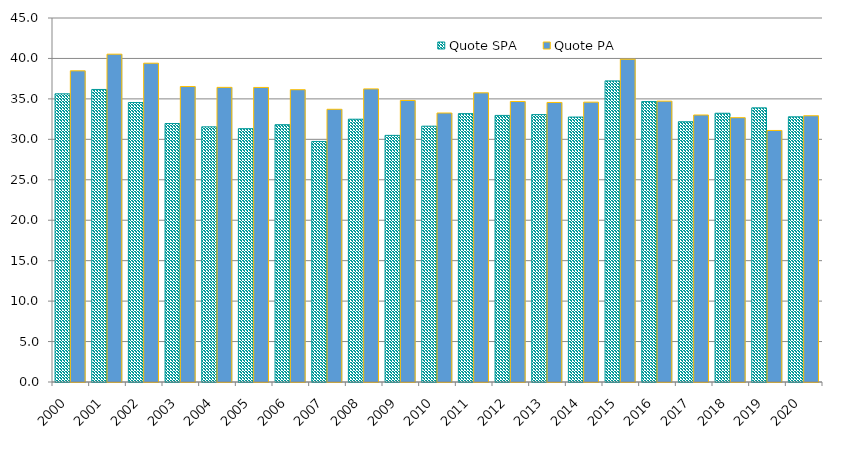
| Category | Quote SPA | Quote PA |
|---|---|---|
| 2000.0 | 35.625 | 38.47 |
| 2001.0 | 36.165 | 40.527 |
| 2002.0 | 34.547 | 39.413 |
| 2003.0 | 31.952 | 36.526 |
| 2004.0 | 31.543 | 36.425 |
| 2005.0 | 31.318 | 36.414 |
| 2006.0 | 31.812 | 36.134 |
| 2007.0 | 29.738 | 33.716 |
| 2008.0 | 32.488 | 36.238 |
| 2009.0 | 30.491 | 34.804 |
| 2010.0 | 31.625 | 33.254 |
| 2011.0 | 33.177 | 35.748 |
| 2012.0 | 32.957 | 34.68 |
| 2013.0 | 33.057 | 34.558 |
| 2014.0 | 32.753 | 34.596 |
| 2015.0 | 37.225 | 39.901 |
| 2016.0 | 34.667 | 34.72 |
| 2017.0 | 32.172 | 33.007 |
| 2018.0 | 33.223 | 32.677 |
| 2019.0 | 33.891 | 31.096 |
| 2020.0 | 32.783 | 32.915 |